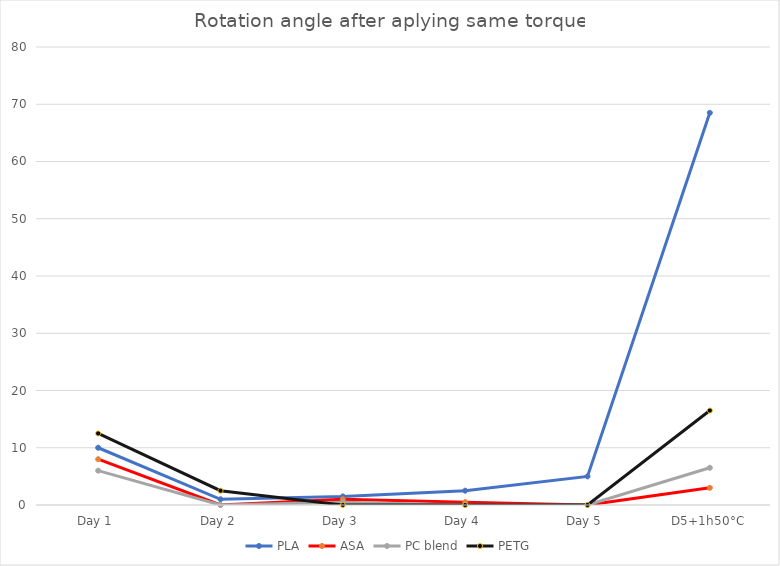
| Category | PLA | ASA | PC blend | PETG |
|---|---|---|---|---|
| Day 1 | 10 | 8 | 6 | 12.5 |
| Day 2 | 1 | 0 | 0 | 2.5 |
| Day 3 | 1.5 | 1 | 0.5 | 0 |
| Day 4 | 2.5 | 0.5 | 0 | 0 |
| Day 5 | 5 | 0 | 0 | 0 |
| D5+1h50°C | 68.5 | 3 | 6.5 | 16.5 |